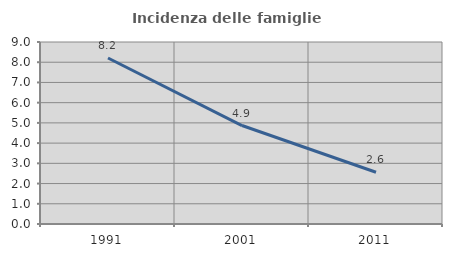
| Category | Incidenza delle famiglie numerose |
|---|---|
| 1991.0 | 8.211 |
| 2001.0 | 4.869 |
| 2011.0 | 2.56 |